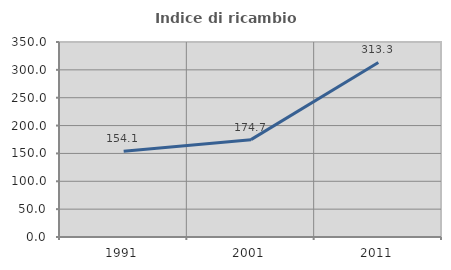
| Category | Indice di ricambio occupazionale  |
|---|---|
| 1991.0 | 154.114 |
| 2001.0 | 174.719 |
| 2011.0 | 313.299 |